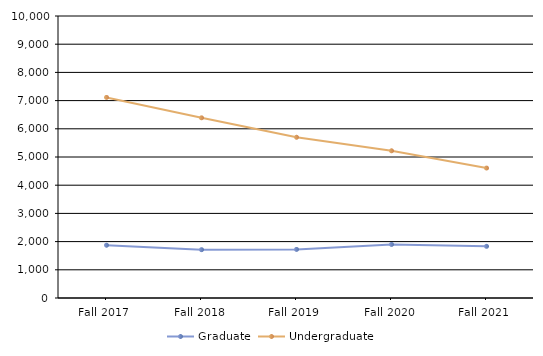
| Category | Graduate | Undergraduate |
|---|---|---|
| Fall 2017 | 1871 | 7113 |
| Fall 2018 | 1713 | 6390 |
| Fall 2019 | 1723 | 5700 |
| Fall 2020 | 1899 | 5220 |
| Fall 2021 | 1832 | 4608 |